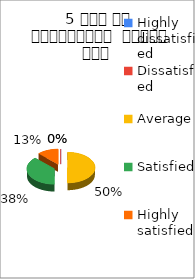
| Category | 5 समय पर पाठ्यक्रम  पूर्ण हुआ  |
|---|---|
| Highly dissatisfied | 0 |
| Dissatisfied | 0 |
| Average | 4 |
| Satisfied | 3 |
| Highly satisfied | 1 |